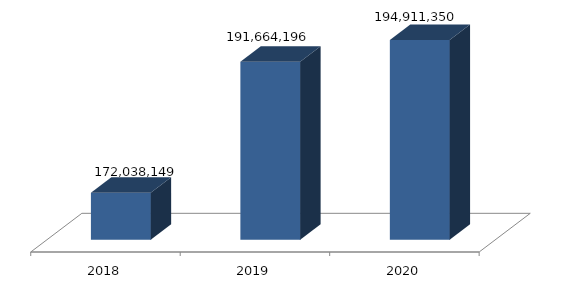
| Category | Series 0 |
|---|---|
| 0 | 172038149 |
| 1 | 191664196 |
| 2 | 194911350 |